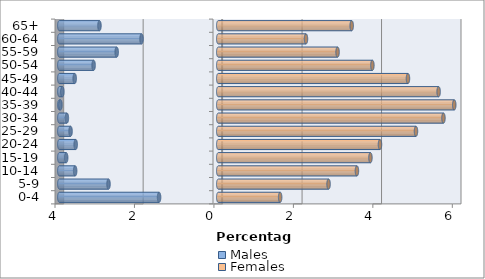
| Category | Males | Females |
|---|---|---|
| 0-4 | -1.489 | 1.557 |
| 5-9 | -2.763 | 2.776 |
| 10-14 | -3.602 | 3.49 |
| 15-19 | -3.828 | 3.83 |
| 20-24 | -3.589 | 4.07 |
| 25-29 | -3.718 | 4.976 |
| 30-34 | -3.81 | 5.667 |
| 35-39 | -3.974 | 5.939 |
| 40-44 | -3.925 | 5.546 |
| 45-49 | -3.613 | 4.774 |
| 50-54 | -3.138 | 3.879 |
| 55-59 | -2.557 | 3.003 |
| 60-64 | -1.931 | 2.207 |
| 65+ | -2.99 | 3.358 |